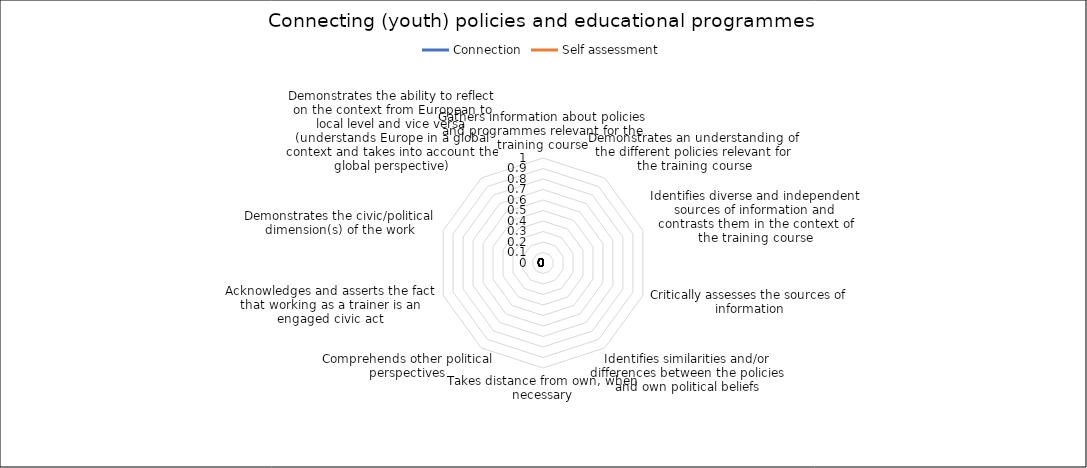
| Category | Connection | Self assessment |
|---|---|---|
| Gathers information about policies and programmes relevant for the training course | 0 | 0 |
| Demonstrates an understanding of the different policies relevant for the training course | 0 | 0 |
| Identifies diverse and independent sources of information and contrasts them in the context of the training course | 0 | 0 |
| Critically assesses the sources of information | 0 | 0 |
| Identifies similarities and/or differences between the policies and own political beliefs | 0 | 0 |
| Takes distance from own, when necessary | 0 | 0 |
| Comprehends other political perspectives | 0 | 0 |
| Acknowledges and asserts the fact that working as a trainer is an engaged civic act | 0 | 0 |
| Demonstrates the civic/political dimension(s) of the work | 0 | 0 |
| Demonstrates the ability to reflect on the context from European to local level and vice versa (understands Europe in a global context and takes into account the global perspective) | 0 | 0 |